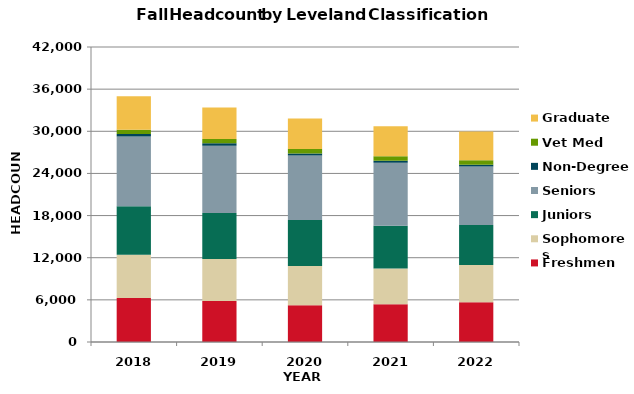
| Category | Freshmen | Sophomores | Juniors | Seniors | Non-Degree | Vet Med | Graduate |
|---|---|---|---|---|---|---|---|
| 2018.0 | 6249 | 6157 | 6936 | 9906 | 373 | 597 | 4774 |
| 2019.0 | 5828 | 5984 | 6565 | 9553 | 364 | 599 | 4498 |
| 2020.0 | 5240 | 5590 | 6540 | 9197 | 279 | 627 | 4352 |
| 2021.0 | 5386 | 5068 | 6088 | 8995 | 271 | 636 | 4264 |
| 2022.0 | 5655 | 5292 | 5694 | 8353 | 247 | 634 | 4094 |